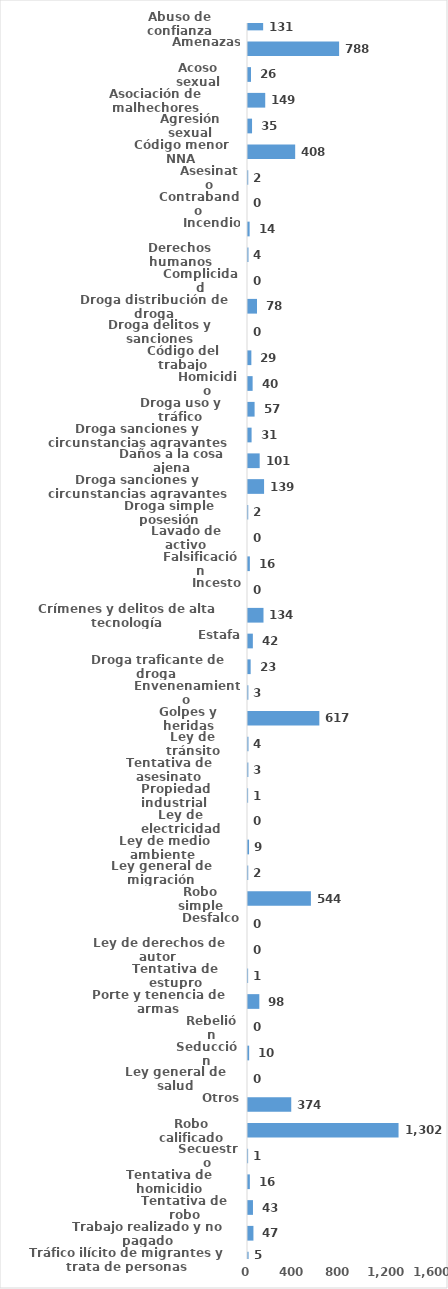
| Category | Series 0 |
|---|---|
| Abuso de confianza | 131 |
| Amenazas | 788 |
| Acoso sexual | 26 |
| Asociación de malhechores | 149 |
| Agresión sexual | 35 |
| Código menor NNA | 408 |
| Asesinato | 2 |
| Contrabando | 0 |
| Incendio | 14 |
| Derechos humanos | 4 |
| Complicidad | 0 |
| Droga distribución de droga | 78 |
| Droga delitos y sanciones | 0 |
| Código del trabajo | 29 |
| Homicidio | 40 |
| Droga uso y tráfico | 57 |
| Droga sanciones y circunstancias agravantes | 31 |
| Daños a la cosa ajena | 101 |
| Droga sanciones y circunstancias agravantes | 139 |
| Droga simple posesión | 2 |
| Lavado de activo | 0 |
| Falsificación | 16 |
| Incesto | 0 |
| Crímenes y delitos de alta tecnología | 134 |
| Estafa | 42 |
| Droga traficante de droga  | 23 |
| Envenenamiento | 3 |
| Golpes y heridas | 617 |
| Ley de tránsito | 4 |
| Tentativa de asesinato | 3 |
| Propiedad industrial  | 1 |
| Ley de electricidad | 0 |
| Ley de medio ambiente  | 9 |
| Ley general de migración | 2 |
| Robo simple | 544 |
| Desfalco | 0 |
| Ley de derechos de autor  | 0 |
| Tentativa de estupro | 1 |
| Porte y tenencia de armas | 98 |
| Rebelión | 0 |
| Seducción | 10 |
| Ley general de salud | 0 |
| Otros | 374 |
| Robo calificado | 1302 |
| Secuestro | 1 |
| Tentativa de homicidio | 16 |
| Tentativa de robo | 43 |
| Trabajo realizado y no pagado | 47 |
| Tráfico ilícito de migrantes y trata de personas | 5 |